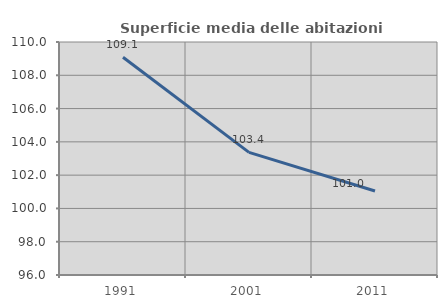
| Category | Superficie media delle abitazioni occupate |
|---|---|
| 1991.0 | 109.088 |
| 2001.0 | 103.368 |
| 2011.0 | 101.047 |